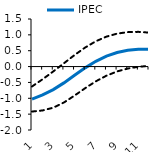
| Category | Series 0 | IPEC | Series 2 |
|---|---|---|---|
| 1.0 | -0.629 | -1.023 | -1.418 |
| 2.0 | -0.399 | -0.891 | -1.383 |
| 3.0 | -0.154 | -0.725 | -1.296 |
| 4.0 | 0.104 | -0.514 | -1.133 |
| 5.0 | 0.363 | -0.276 | -0.915 |
| 6.0 | 0.601 | -0.04 | -0.682 |
| 7.0 | 0.798 | 0.166 | -0.465 |
| 8.0 | 0.944 | 0.329 | -0.287 |
| 9.0 | 1.039 | 0.443 | -0.153 |
| 10.0 | 1.087 | 0.512 | -0.062 |
| 11.0 | 1.095 | 0.544 | -0.007 |
| 12.0 | 1.071 | 0.546 | 0.021 |